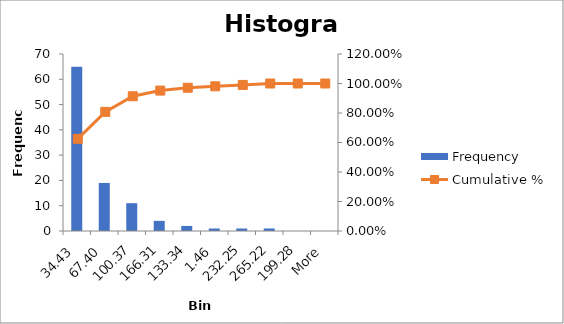
| Category | Frequency |
|---|---|
| 34.43 | 65 |
| 67.40 | 19 |
| 100.37 | 11 |
| 166.31 | 4 |
| 133.34 | 2 |
| 1.46 | 1 |
| 232.25 | 1 |
| 265.22 | 1 |
| 199.28 | 0 |
| More | 0 |